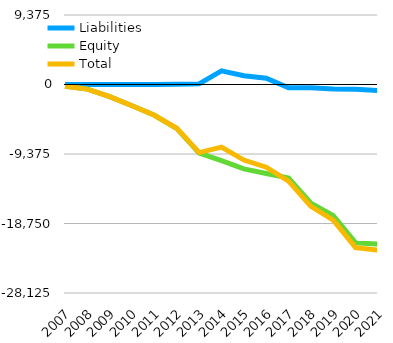
| Category | Liabilities  | Equity  | Total  |
|---|---|---|---|
| 2007 | 0 | -243 | -243 |
| 2008 | 0 | -623 | -623 |
| 2009 | 0 | -1631 | -1631 |
| 2010 | 0 | -2867 | -2867 |
| 2011 | 5 | -4149 | -4144 |
| 2012 | 50 | -5955 | -5905 |
| 2013 | 84 | -9266 | -9182 |
| 2014 | 1834 | -10277 | -8443 |
| 2015 | 1193 | -11385 | -10192 |
| 2016 | 840 | -11996 | -11156 |
| 2017 | -431 | -12608 | -13039 |
| 2018 | -444 | -16000 | -16444 |
| 2019 | -594 | -17691 | -18285 |
| 2020 | -644 | -21365 | -22009 |
| 2021 | -804 | -21535 | -22339 |